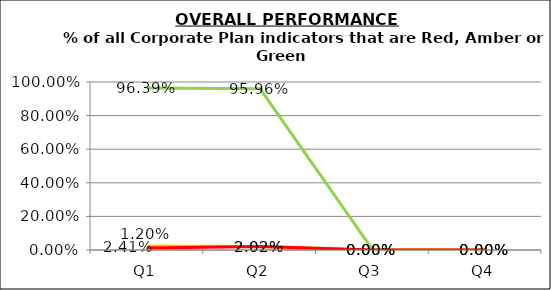
| Category | Green | Amber | Red |
|---|---|---|---|
| Q1 | 0.964 | 0.024 | 0.012 |
| Q2 | 0.96 | 0.02 | 0.02 |
| Q3 | 0 | 0 | 0 |
| Q4 | 0 | 0 | 0 |